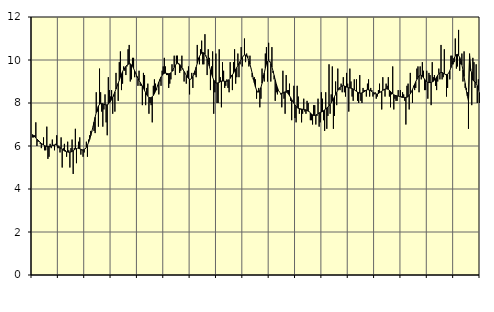
| Category | Piggar | Series 1 |
|---|---|---|
| nan | 6.4 | 6.53 |
| 87.0 | 6.4 | 6.49 |
| 87.0 | 6.5 | 6.42 |
| 87.0 | 7.1 | 6.37 |
| 87.0 | 6 | 6.32 |
| 87.0 | 6.2 | 6.27 |
| 87.0 | 6.2 | 6.22 |
| 87.0 | 6.1 | 6.17 |
| 87.0 | 5.9 | 6.12 |
| 87.0 | 6.1 | 6.08 |
| 87.0 | 6.4 | 6.05 |
| 87.0 | 5.8 | 6.02 |
| nan | 5.8 | 5.99 |
| 88.0 | 6.9 | 5.98 |
| 88.0 | 5.4 | 5.97 |
| 88.0 | 5.5 | 5.97 |
| 88.0 | 6.1 | 5.98 |
| 88.0 | 5.9 | 6 |
| 88.0 | 6.3 | 6.02 |
| 88.0 | 6 | 6.04 |
| 88.0 | 5.8 | 6.05 |
| 88.0 | 6.1 | 6.06 |
| 88.0 | 6.5 | 6.04 |
| 88.0 | 5.9 | 6.01 |
| nan | 5.9 | 5.98 |
| 89.0 | 5.7 | 5.93 |
| 89.0 | 6.4 | 5.88 |
| 89.0 | 5 | 5.84 |
| 89.0 | 5.9 | 5.81 |
| 89.0 | 6.1 | 5.77 |
| 89.0 | 5.8 | 5.75 |
| 89.0 | 5.5 | 5.73 |
| 89.0 | 6.2 | 5.72 |
| 89.0 | 5.8 | 5.71 |
| 89.0 | 5 | 5.71 |
| 89.0 | 5.9 | 5.72 |
| nan | 6.3 | 5.75 |
| 90.0 | 4.7 | 5.78 |
| 90.0 | 5.9 | 5.82 |
| 90.0 | 6.8 | 5.86 |
| 90.0 | 5.2 | 5.88 |
| 90.0 | 5.9 | 5.9 |
| 90.0 | 6.2 | 5.89 |
| 90.0 | 6.4 | 5.87 |
| 90.0 | 5.6 | 5.85 |
| 90.0 | 5.8 | 5.82 |
| 90.0 | 5.5 | 5.82 |
| 90.0 | 5.7 | 5.83 |
| nan | 5.9 | 5.87 |
| 91.0 | 6.2 | 5.94 |
| 91.0 | 5.5 | 6.04 |
| 91.0 | 6.3 | 6.16 |
| 91.0 | 6.5 | 6.3 |
| 91.0 | 6.7 | 6.48 |
| 91.0 | 6.7 | 6.68 |
| 91.0 | 6.9 | 6.89 |
| 91.0 | 6.7 | 7.11 |
| 91.0 | 6.6 | 7.34 |
| 91.0 | 8.5 | 7.55 |
| 91.0 | 7.6 | 7.73 |
| nan | 6.9 | 7.86 |
| 92.0 | 9.6 | 7.94 |
| 92.0 | 8.5 | 7.97 |
| 92.0 | 7.6 | 7.98 |
| 92.0 | 6.9 | 7.97 |
| 92.0 | 7.7 | 7.94 |
| 92.0 | 8.4 | 7.92 |
| 92.0 | 7.1 | 7.91 |
| 92.0 | 6.5 | 7.92 |
| 92.0 | 9.2 | 7.95 |
| 92.0 | 8.6 | 8 |
| 92.0 | 8.3 | 8.07 |
| nan | 8.6 | 8.16 |
| 93.0 | 7.5 | 8.27 |
| 93.0 | 8.3 | 8.39 |
| 93.0 | 7.6 | 8.52 |
| 93.0 | 9.4 | 8.65 |
| 93.0 | 8.8 | 8.79 |
| 93.0 | 8.1 | 8.92 |
| 93.0 | 9.9 | 9.06 |
| 93.0 | 10.4 | 9.21 |
| 93.0 | 8.6 | 9.35 |
| 93.0 | 8.9 | 9.46 |
| 93.0 | 9.7 | 9.56 |
| nan | 9.5 | 9.63 |
| 94.0 | 9.3 | 9.7 |
| 94.0 | 9.7 | 9.76 |
| 94.0 | 10.5 | 9.8 |
| 94.0 | 10.7 | 9.82 |
| 94.0 | 9 | 9.82 |
| 94.0 | 9.1 | 9.78 |
| 94.0 | 10.1 | 9.71 |
| 94.0 | 10.1 | 9.61 |
| 94.0 | 9.2 | 9.49 |
| 94.0 | 9.4 | 9.37 |
| 94.0 | 9.2 | 9.25 |
| nan | 8.8 | 9.14 |
| 95.0 | 9.5 | 9.05 |
| 95.0 | 8.8 | 8.96 |
| 95.0 | 8.8 | 8.88 |
| 95.0 | 7.9 | 8.79 |
| 95.0 | 9.4 | 8.69 |
| 95.0 | 9.3 | 8.58 |
| 95.0 | 7.9 | 8.48 |
| 95.0 | 8.7 | 8.38 |
| 95.0 | 8.9 | 8.31 |
| 95.0 | 7.5 | 8.26 |
| 95.0 | 8 | 8.24 |
| nan | 7.9 | 8.25 |
| 96.0 | 7.1 | 8.29 |
| 96.0 | 8.8 | 8.35 |
| 96.0 | 9.1 | 8.44 |
| 96.0 | 8.9 | 8.55 |
| 96.0 | 8.6 | 8.68 |
| 96.0 | 8.8 | 8.83 |
| 96.0 | 8.4 | 8.97 |
| 96.0 | 9 | 9.1 |
| 96.0 | 8.8 | 9.21 |
| 96.0 | 9.5 | 9.29 |
| 96.0 | 9.7 | 9.35 |
| nan | 10.1 | 9.38 |
| 97.0 | 9.7 | 9.39 |
| 97.0 | 9.3 | 9.38 |
| 97.0 | 9.3 | 9.37 |
| 97.0 | 8.7 | 9.36 |
| 97.0 | 8.9 | 9.37 |
| 97.0 | 9.1 | 9.4 |
| 97.0 | 9.8 | 9.47 |
| 97.0 | 9.5 | 9.56 |
| 97.0 | 10.2 | 9.66 |
| 97.0 | 9.3 | 9.76 |
| 97.0 | 10.2 | 9.82 |
| nan | 10.2 | 9.85 |
| 98.0 | 9.8 | 9.84 |
| 98.0 | 9.4 | 9.8 |
| 98.0 | 9.5 | 9.73 |
| 98.0 | 10.2 | 9.64 |
| 98.0 | 9.6 | 9.56 |
| 98.0 | 9 | 9.47 |
| 98.0 | 9.4 | 9.38 |
| 98.0 | 8.9 | 9.28 |
| 98.0 | 9.5 | 9.2 |
| 98.0 | 9.7 | 9.14 |
| 98.0 | 8.4 | 9.11 |
| nan | 9.1 | 9.11 |
| 99.0 | 9.4 | 9.15 |
| 99.0 | 8.7 | 9.23 |
| 99.0 | 9.4 | 9.35 |
| 99.0 | 9.3 | 9.5 |
| 99.0 | 9.2 | 9.67 |
| 99.0 | 10.7 | 9.84 |
| 99.0 | 10.1 | 10.01 |
| 99.0 | 9.8 | 10.16 |
| 99.0 | 10.5 | 10.26 |
| 99.0 | 10.9 | 10.33 |
| 99.0 | 9.8 | 10.35 |
| nan | 9.8 | 10.33 |
| 0.0 | 11.2 | 10.27 |
| 0.0 | 10.2 | 10.17 |
| 0.0 | 9.3 | 10.04 |
| 0.0 | 10.5 | 9.88 |
| 0.0 | 10.1 | 9.71 |
| 0.0 | 8.6 | 9.53 |
| 0.0 | 9.7 | 9.35 |
| 0.0 | 10.4 | 9.2 |
| 0.0 | 7.5 | 9.07 |
| 0.0 | 8.5 | 8.98 |
| 0.0 | 10.3 | 8.93 |
| nan | 8 | 8.92 |
| 1.0 | 8 | 8.94 |
| 1.0 | 10.5 | 8.96 |
| 1.0 | 9.2 | 8.99 |
| 1.0 | 7.8 | 9.02 |
| 1.0 | 9.9 | 9.02 |
| 1.0 | 9.5 | 9.02 |
| 1.0 | 8.7 | 9.01 |
| 1.0 | 8.8 | 9.01 |
| 1.0 | 9.1 | 9.01 |
| 1.0 | 8.7 | 9.04 |
| 1.0 | 8.5 | 9.09 |
| nan | 9.9 | 9.15 |
| 2.0 | 9.3 | 9.23 |
| 2.0 | 8.6 | 9.31 |
| 2.0 | 9.9 | 9.39 |
| 2.0 | 10.5 | 9.48 |
| 2.0 | 8.9 | 9.57 |
| 2.0 | 9.2 | 9.65 |
| 2.0 | 10.3 | 9.74 |
| 2.0 | 9.2 | 9.84 |
| 2.0 | 9.8 | 9.93 |
| 2.0 | 10.6 | 10.03 |
| 2.0 | 9.7 | 10.12 |
| nan | 10.2 | 10.19 |
| 3.0 | 11 | 10.23 |
| 3.0 | 9.9 | 10.23 |
| 3.0 | 10.3 | 10.19 |
| 3.0 | 10.2 | 10.1 |
| 3.0 | 9.7 | 9.97 |
| 3.0 | 10.2 | 9.8 |
| 3.0 | 9.6 | 9.61 |
| 3.0 | 9.2 | 9.39 |
| 3.0 | 9.1 | 9.16 |
| 3.0 | 9.2 | 8.94 |
| 3.0 | 9.1 | 8.75 |
| nan | 8.2 | 8.6 |
| 4.0 | 8.5 | 8.51 |
| 4.0 | 8.7 | 8.51 |
| 4.0 | 7.8 | 8.58 |
| 4.0 | 8.2 | 8.72 |
| 4.0 | 9.6 | 8.92 |
| 4.0 | 9.3 | 9.15 |
| 4.0 | 9 | 9.39 |
| 4.0 | 10.3 | 9.62 |
| 4.0 | 10.6 | 9.81 |
| 4.0 | 9 | 9.93 |
| 4.0 | 10.8 | 9.97 |
| nan | 9.9 | 9.94 |
| 5.0 | 9 | 9.84 |
| 5.0 | 10.6 | 9.68 |
| 5.0 | 9.4 | 9.49 |
| 5.0 | 9.1 | 9.28 |
| 5.0 | 8.1 | 9.08 |
| 5.0 | 8.5 | 8.88 |
| 5.0 | 8.4 | 8.72 |
| 5.0 | 8.6 | 8.58 |
| 5.0 | 8.5 | 8.5 |
| 5.0 | 8.4 | 8.45 |
| 5.0 | 7.8 | 8.45 |
| nan | 9.5 | 8.46 |
| 6.0 | 8.2 | 8.49 |
| 6.0 | 7.5 | 8.52 |
| 6.0 | 9.3 | 8.51 |
| 6.0 | 8.6 | 8.48 |
| 6.0 | 8.6 | 8.42 |
| 6.0 | 8.9 | 8.34 |
| 6.0 | 8.1 | 8.26 |
| 6.0 | 7.2 | 8.16 |
| 6.0 | 8.1 | 8.07 |
| 6.0 | 8.8 | 7.99 |
| 6.0 | 7.3 | 7.91 |
| nan | 7.1 | 7.84 |
| 7.0 | 8.8 | 7.79 |
| 7.0 | 8.3 | 7.75 |
| 7.0 | 7.5 | 7.74 |
| 7.0 | 7.7 | 7.73 |
| 7.0 | 7.1 | 7.72 |
| 7.0 | 7.5 | 7.71 |
| 7.0 | 8.2 | 7.7 |
| 7.0 | 7.6 | 7.69 |
| 7.0 | 7.5 | 7.68 |
| 7.0 | 8.1 | 7.65 |
| 7.0 | 8 | 7.62 |
| nan | 7.6 | 7.59 |
| 8.0 | 7.2 | 7.54 |
| 8.0 | 7.2 | 7.49 |
| 8.0 | 7 | 7.45 |
| 8.0 | 7.9 | 7.42 |
| 8.0 | 7.9 | 7.42 |
| 8.0 | 7 | 7.44 |
| 8.0 | 7.4 | 7.47 |
| 8.0 | 8.2 | 7.5 |
| 8.0 | 6.9 | 7.54 |
| 8.0 | 7.1 | 7.56 |
| 8.0 | 8.5 | 7.58 |
| nan | 8.2 | 7.6 |
| 9.0 | 7.2 | 7.64 |
| 9.0 | 6.7 | 7.68 |
| 9.0 | 8.5 | 7.72 |
| 9.0 | 6.8 | 7.77 |
| 9.0 | 7.4 | 7.81 |
| 9.0 | 9.8 | 7.87 |
| 9.0 | 7.5 | 7.93 |
| 9.0 | 8.4 | 8.01 |
| 9.0 | 9.7 | 8.1 |
| 9.0 | 6.8 | 8.2 |
| 9.0 | 7.4 | 8.3 |
| nan | 9 | 8.4 |
| 10.0 | 7.9 | 8.49 |
| 10.0 | 9.6 | 8.59 |
| 10.0 | 8.7 | 8.67 |
| 10.0 | 8.6 | 8.73 |
| 10.0 | 8.9 | 8.77 |
| 10.0 | 8.5 | 8.8 |
| 10.0 | 9.2 | 8.81 |
| 10.0 | 8.5 | 8.79 |
| 10.0 | 8.3 | 8.77 |
| 10.0 | 9.4 | 8.74 |
| 10.0 | 8.9 | 8.73 |
| nan | 7.6 | 8.71 |
| 11.0 | 9.6 | 8.7 |
| 11.0 | 9 | 8.69 |
| 11.0 | 8.3 | 8.67 |
| 11.0 | 8.1 | 8.65 |
| 11.0 | 9.1 | 8.62 |
| 11.0 | 8.6 | 8.58 |
| 11.0 | 9.1 | 8.54 |
| 11.0 | 8.1 | 8.51 |
| 11.0 | 8 | 8.48 |
| 11.0 | 9.3 | 8.46 |
| 11.0 | 8.1 | 8.46 |
| nan | 8 | 8.47 |
| 12.0 | 8.7 | 8.5 |
| 12.0 | 8.6 | 8.53 |
| 12.0 | 8.6 | 8.56 |
| 12.0 | 8.3 | 8.6 |
| 12.0 | 8.9 | 8.62 |
| 12.0 | 9.1 | 8.61 |
| 12.0 | 8.3 | 8.6 |
| 12.0 | 8.7 | 8.57 |
| 12.0 | 8.6 | 8.53 |
| 12.0 | 8.3 | 8.49 |
| 12.0 | 8.4 | 8.46 |
| nan | 8.5 | 8.44 |
| 13.0 | 8.2 | 8.42 |
| 13.0 | 8.3 | 8.42 |
| 13.0 | 8.6 | 8.44 |
| 13.0 | 8.9 | 8.48 |
| 13.0 | 8.5 | 8.52 |
| 13.0 | 7.7 | 8.55 |
| 13.0 | 9.2 | 8.59 |
| 13.0 | 8.6 | 8.62 |
| 13.0 | 8.3 | 8.65 |
| 13.0 | 8.9 | 8.66 |
| 13.0 | 8.8 | 8.65 |
| nan | 9.2 | 8.63 |
| 14.0 | 8.3 | 8.59 |
| 14.0 | 7.8 | 8.54 |
| 14.0 | 8.4 | 8.48 |
| 14.0 | 9.7 | 8.42 |
| 14.0 | 7.7 | 8.38 |
| 14.0 | 8.2 | 8.36 |
| 14.0 | 8.1 | 8.34 |
| 14.0 | 8.1 | 8.33 |
| 14.0 | 8.6 | 8.32 |
| 14.0 | 8.3 | 8.31 |
| 14.0 | 8.6 | 8.29 |
| nan | 8.3 | 8.27 |
| 15.0 | 8.5 | 8.26 |
| 15.0 | 8.4 | 8.26 |
| 15.0 | 8.1 | 8.26 |
| 15.0 | 7 | 8.26 |
| 15.0 | 8.8 | 8.27 |
| 15.0 | 8.9 | 8.3 |
| 15.0 | 7.7 | 8.36 |
| 15.0 | 9.4 | 8.43 |
| 15.0 | 8.5 | 8.53 |
| 15.0 | 8 | 8.63 |
| 15.0 | 8.8 | 8.75 |
| nan | 8.6 | 8.87 |
| 16.0 | 8.7 | 8.99 |
| 16.0 | 9.6 | 9.1 |
| 16.0 | 9.7 | 9.19 |
| 16.0 | 8.5 | 9.26 |
| 16.0 | 9.7 | 9.3 |
| 16.0 | 9.1 | 9.29 |
| 16.0 | 9.9 | 9.25 |
| 16.0 | 9.5 | 9.18 |
| 16.0 | 8.6 | 9.11 |
| 16.0 | 8.6 | 9.04 |
| 16.0 | 9.5 | 9 |
| nan | 8.2 | 8.97 |
| 17.0 | 9.4 | 8.95 |
| 17.0 | 9.3 | 8.95 |
| 17.0 | 7.9 | 8.96 |
| 17.0 | 9.9 | 8.98 |
| 17.0 | 9.2 | 9.01 |
| 17.0 | 9.3 | 9.06 |
| 17.0 | 8.8 | 9.13 |
| 17.0 | 8.6 | 9.21 |
| 17.0 | 9 | 9.29 |
| 17.0 | 9.6 | 9.36 |
| 17.0 | 9.1 | 9.4 |
| nan | 10.7 | 9.42 |
| 18.0 | 9.1 | 9.42 |
| 18.0 | 9.2 | 9.39 |
| 18.0 | 10.5 | 9.36 |
| 18.0 | 9.3 | 9.33 |
| 18.0 | 8.3 | 9.32 |
| 18.0 | 8.7 | 9.33 |
| 18.0 | 9.4 | 9.4 |
| 18.0 | 9.1 | 9.5 |
| 18.0 | 10.2 | 9.64 |
| 18.0 | 10.2 | 9.8 |
| 18.0 | 9.8 | 9.96 |
| nan | 9.9 | 10.09 |
| 19.0 | 11 | 10.19 |
| 19.0 | 9.6 | 10.25 |
| 19.0 | 9.7 | 10.26 |
| 19.0 | 11.4 | 10.21 |
| 19.0 | 9.5 | 10.12 |
| 19.0 | 9.8 | 9.98 |
| 19.0 | 10.3 | 9.78 |
| 19.0 | 9 | 9.53 |
| 19.0 | 10.4 | 9.23 |
| 19.0 | 8.7 | 8.91 |
| 19.0 | 8.7 | 8.6 |
| nan | 8.5 | 8.32 |
| 20.0 | 6.8 | 8.09 |
| 20.0 | 10.3 | 10.21 |
| 20.0 | 9.6 | 9.5 |
| 20.0 | 7.9 | 9.43 |
| 20.0 | 10.1 | 9.06 |
| 20.0 | 9.9 | 9.02 |
| 20.0 | 8.7 | 8.98 |
| 20.0 | 9.8 | 8.91 |
| 20.0 | 8 | 8.8 |
| 20.0 | 9.1 | 8.66 |
| 20.0 | 8 | 8.49 |